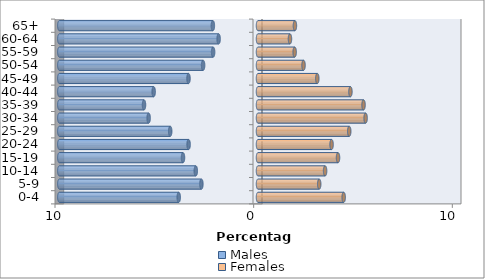
| Category | Males | Females |
|---|---|---|
| 0-4 | -3.991 | 4.313 |
| 5-9 | -2.85 | 3.081 |
| 10-14 | -3.132 | 3.378 |
| 15-19 | -3.775 | 4.028 |
| 20-24 | -3.493 | 3.704 |
| 25-29 | -4.419 | 4.592 |
| 30-34 | -5.505 | 5.417 |
| 35-39 | -5.738 | 5.313 |
| 40-44 | -5.252 | 4.653 |
| 45-49 | -3.498 | 2.985 |
| 50-54 | -2.763 | 2.292 |
| 55-59 | -2.259 | 1.845 |
| 60-64 | -1.982 | 1.609 |
| 65+ | -2.272 | 1.858 |